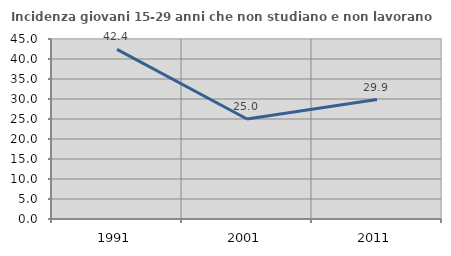
| Category | Incidenza giovani 15-29 anni che non studiano e non lavorano  |
|---|---|
| 1991.0 | 42.396 |
| 2001.0 | 25 |
| 2011.0 | 29.851 |